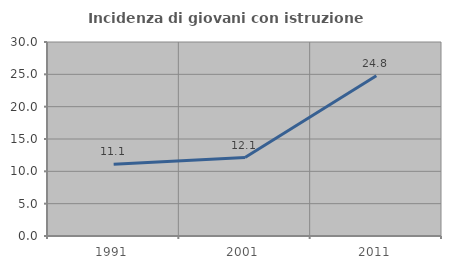
| Category | Incidenza di giovani con istruzione universitaria |
|---|---|
| 1991.0 | 11.111 |
| 2001.0 | 12.131 |
| 2011.0 | 24.766 |